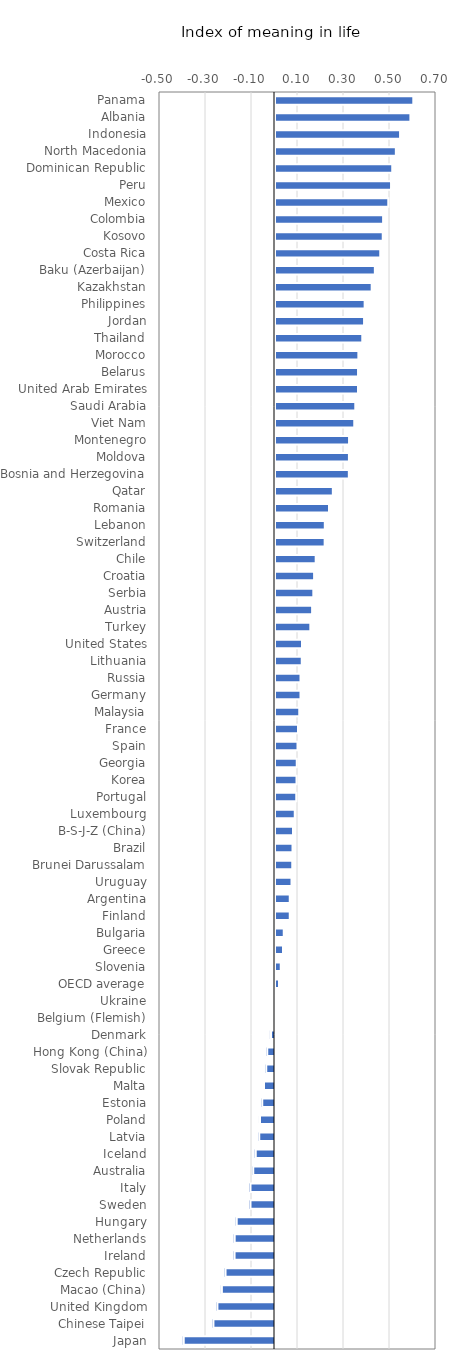
| Category | Index of meaning in life |
|---|---|
| Panama | 0.601 |
| Albania | 0.589 |
| Indonesia | 0.544 |
| North Macedonia | 0.525 |
| Dominican Republic | 0.51 |
| Peru | 0.505 |
| Mexico | 0.492 |
| Colombia | 0.47 |
| Kosovo | 0.468 |
| Costa Rica | 0.458 |
| Baku (Azerbaijan) | 0.434 |
| Kazakhstan | 0.42 |
| Philippines | 0.39 |
| Jordan | 0.387 |
| Thailand | 0.379 |
| Morocco | 0.362 |
| Belarus | 0.361 |
| United Arab Emirates | 0.361 |
| Saudi Arabia | 0.349 |
| Viet Nam | 0.345 |
| Montenegro | 0.322 |
| Moldova | 0.321 |
| Bosnia and Herzegovina | 0.321 |
| Qatar | 0.251 |
| Romania | 0.235 |
| Lebanon | 0.217 |
| Switzerland | 0.216 |
| Chile | 0.177 |
| Croatia | 0.17 |
| Serbia | 0.167 |
| Austria | 0.161 |
| Turkey | 0.154 |
| United States | 0.117 |
| Lithuania | 0.117 |
| Russia | 0.111 |
| Germany | 0.11 |
| Malaysia | 0.105 |
| France | 0.1 |
| Spain | 0.097 |
| Georgia | 0.094 |
| Korea | 0.093 |
| Portugal | 0.092 |
| Luxembourg | 0.086 |
| B-S-J-Z (China) | 0.078 |
| Brazil | 0.076 |
| Brunei Darussalam | 0.075 |
| Uruguay | 0.072 |
| Argentina | 0.064 |
| Finland | 0.064 |
| Bulgaria | 0.038 |
| Greece | 0.035 |
| Slovenia | 0.025 |
| OECD average | 0.018 |
| Ukraine | 0.006 |
| Belgium (Flemish) | 0 |
| Denmark | -0.018 |
| Hong Kong (China) | -0.034 |
| Slovak Republic | -0.038 |
| Malta | -0.048 |
| Estonia | -0.056 |
| Poland | -0.065 |
| Latvia | -0.068 |
| Iceland | -0.084 |
| Australia | -0.094 |
| Italy | -0.107 |
| Sweden | -0.107 |
| Hungary | -0.166 |
| Netherlands | -0.175 |
| Ireland | -0.176 |
| Czech Republic | -0.215 |
| Macao (China) | -0.231 |
| United Kingdom | -0.25 |
| Chinese Taipei | -0.268 |
| Japan | -0.397 |